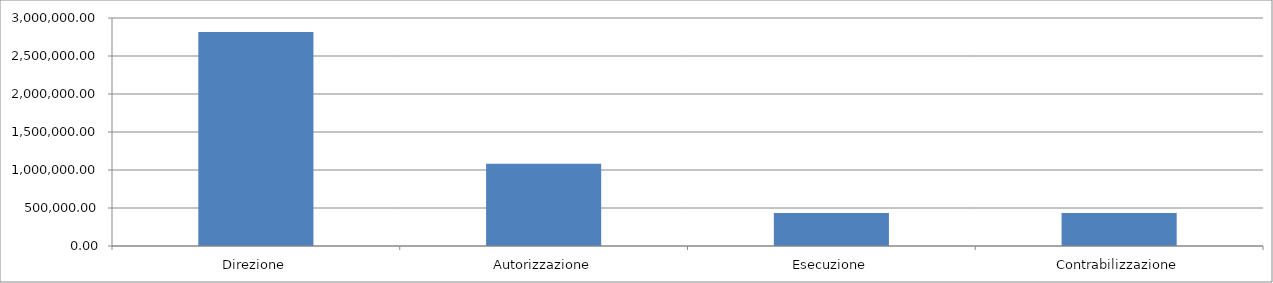
| Category | Series 0 |
|---|---|
| Direzione | 2815872.174 |
| Autorizzazione | 1083027.759 |
| Esecuzione | 433211.104 |
| Contrabilizzazione | 433211.104 |